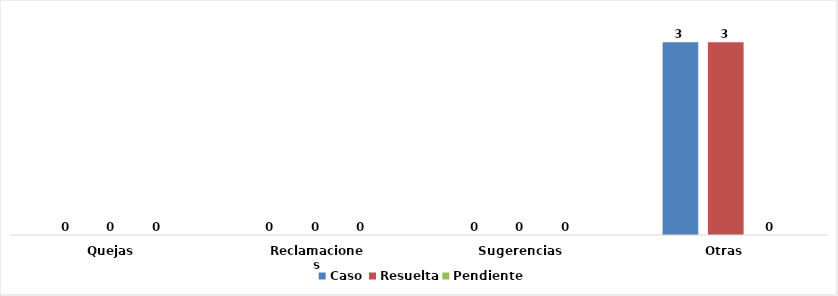
| Category | Caso | Resuelta | Pendiente |
|---|---|---|---|
| Quejas | 0 | 0 | 0 |
| Reclamaciones | 0 | 0 | 0 |
| Sugerencias | 0 | 0 | 0 |
| Otras | 3 | 3 | 0 |